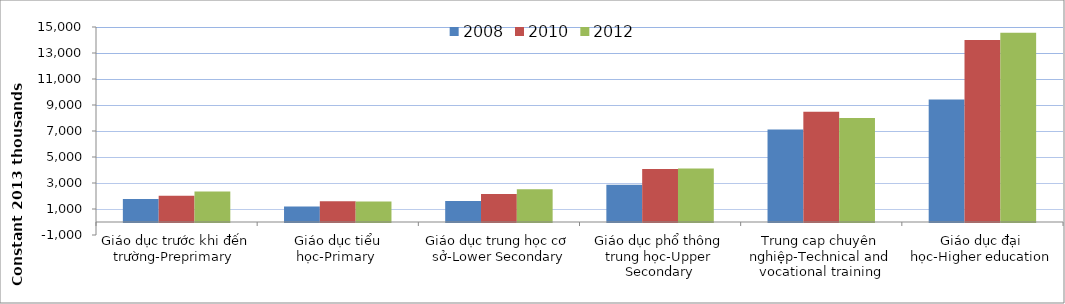
| Category | 2008 | 2010 | 2012 |
|---|---|---|---|
| Giáo dục trước khi đến trường-Preprimary  | 1770.364 | 2016.68 | 2337.177 |
| Giáo dục tiểu học-Primary  | 1198.38 | 1599.683 | 1571.858 |
| Giáo dục trung học cơ sở-Lower Secondary | 1610.627 | 2154.043 | 2517.559 |
| Giáo dục phổ thông trung học-Upper Secondary | 2866.265 | 4073.66 | 4118.405 |
| Trung cap chuyên nghiệp-Technical and vocational training | 7108.213 | 8484.995 | 7991.453 |
| Giáo dục đại học-Higher education | 9421.101 | 14005.071 | 14554.041 |